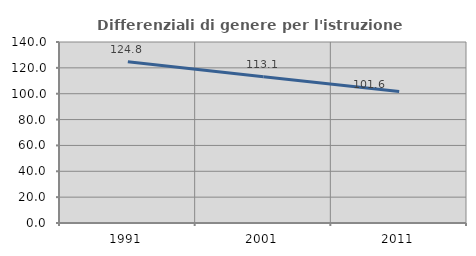
| Category | Differenziali di genere per l'istruzione superiore |
|---|---|
| 1991.0 | 124.79 |
| 2001.0 | 113.056 |
| 2011.0 | 101.627 |